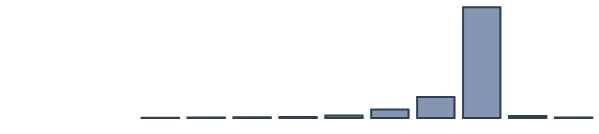
| Category | Series 0 |
|---|---|
| 0 | 0 |
| 1 | 0 |
| 2 | 0 |
| 3 | 0.1 |
| 4 | 0.4 |
| 5 | 0.5 |
| 6 | 0.6 |
| 7 | 1.7 |
| 8 | 5.7 |
| 9 | 14.3 |
| 10 | 75.1 |
| 11 | 1.4 |
| 12 | 0.3 |